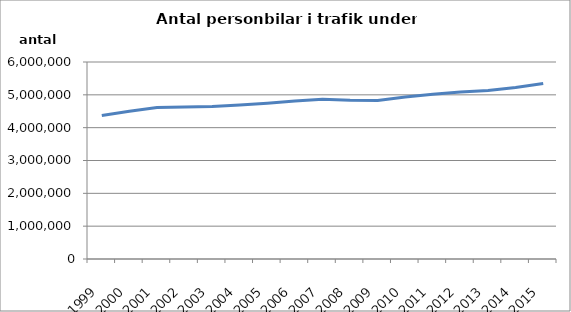
| Category | Series 0 |
|---|---|
| 1999.0 | 4370924 |
| 2000.0 | 4496868 |
| 2001.0 | 4616118 |
| 2002.0 | 4628334 |
| 2003.0 | 4643535 |
| 2004.0 | 4689599 |
| 2005.0 | 4744718 |
| 2006.0 | 4813525 |
| 2007.0 | 4867107 |
| 2008.0 | 4833533 |
| 2009.0 | 4827462 |
| 2010.0 | 4934447 |
| 2011.0 | 5017674 |
| 2012.0 | 5084351 |
| 2013.0 | 5133323 |
| 2014.0 | 5222751 |
| 2015.0 | 5346543 |